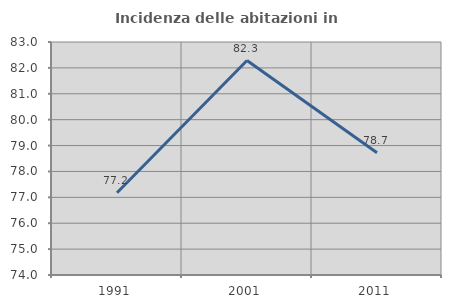
| Category | Incidenza delle abitazioni in proprietà  |
|---|---|
| 1991.0 | 77.175 |
| 2001.0 | 82.285 |
| 2011.0 | 78.719 |